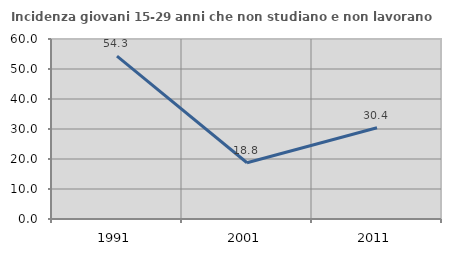
| Category | Incidenza giovani 15-29 anni che non studiano e non lavorano  |
|---|---|
| 1991.0 | 54.268 |
| 2001.0 | 18.75 |
| 2011.0 | 30.392 |